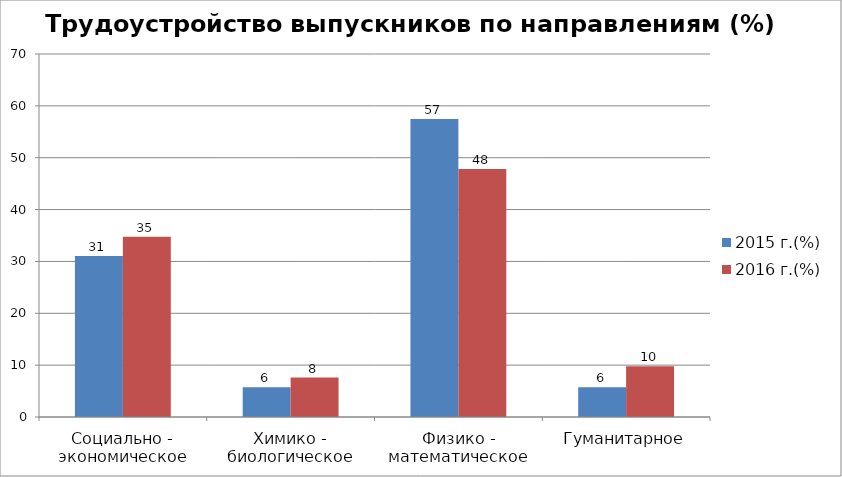
| Category | 2015 г.(%) | 2016 г.(%) |
|---|---|---|
| Социально - экономическое | 31.034 | 34.783 |
| Химико - биологическое | 5.747 | 7.609 |
| Физико - математическое | 57.471 | 47.826 |
| Гуманитарное | 5.747 | 9.783 |